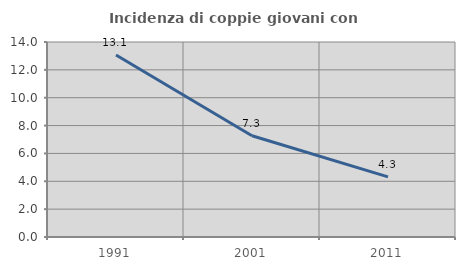
| Category | Incidenza di coppie giovani con figli |
|---|---|
| 1991.0 | 13.068 |
| 2001.0 | 7.273 |
| 2011.0 | 4.319 |